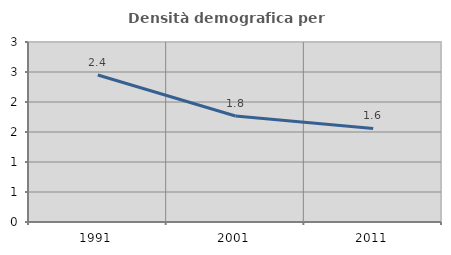
| Category | Densità demografica |
|---|---|
| 1991.0 | 2.45 |
| 2001.0 | 1.768 |
| 2011.0 | 1.559 |